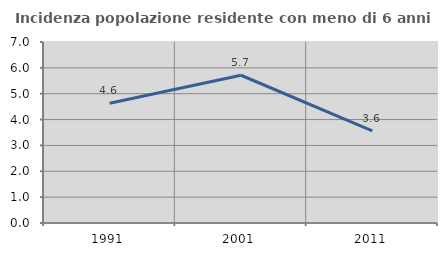
| Category | Incidenza popolazione residente con meno di 6 anni |
|---|---|
| 1991.0 | 4.631 |
| 2001.0 | 5.714 |
| 2011.0 | 3.563 |